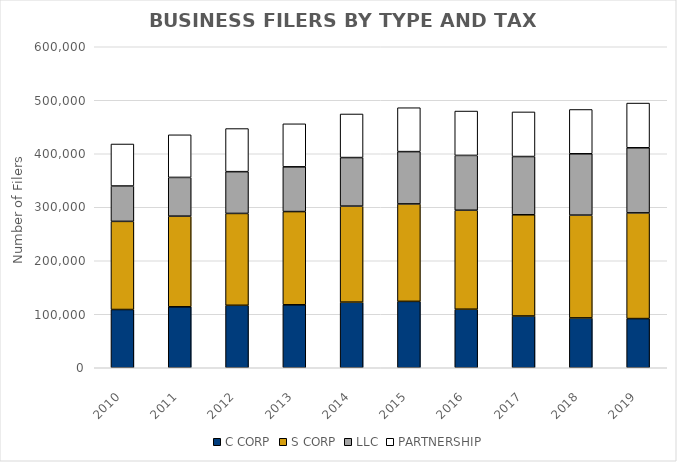
| Category | C CORP | S CORP | LLC | PARTNERSHIP |
|---|---|---|---|---|
| 2010.0 | 108861 | 164745 | 66126 | 78511 |
| 2011.0 | 113909 | 169451 | 72408 | 79650 |
| 2012.0 | 116744 | 171710 | 78089 | 80563 |
| 2013.0 | 117681 | 174238 | 83645 | 80409 |
| 2014.0 | 122660 | 179419 | 90814 | 81455 |
| 2015.0 | 124069 | 182176 | 97773 | 82031 |
| 2016.0 | 109413 | 185018 | 102500 | 82897 |
| 2017.0 | 96737 | 189194 | 108888 | 83372 |
| 2018.0 | 93161 | 192102 | 114705 | 82778 |
| 2019.0 | 91929 | 197547 | 121703 | 83563 |